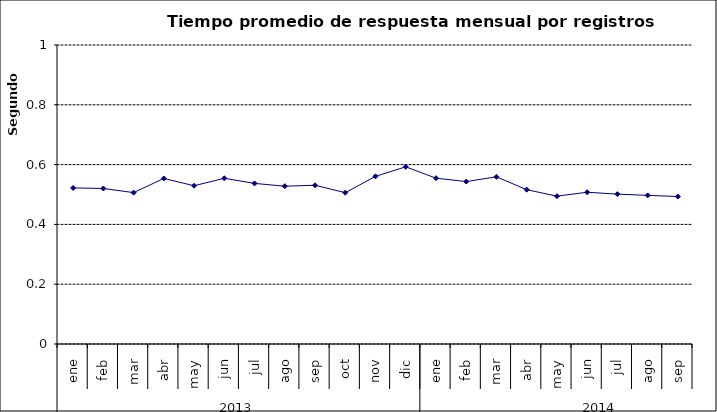
| Category | Tiempo promedio de respuesta por registros cámara PH ** |
|---|---|
| 0 | 0.522 |
| 1 | 0.52 |
| 2 | 0.506 |
| 3 | 0.554 |
| 4 | 0.529 |
| 5 | 0.554 |
| 6 | 0.537 |
| 7 | 0.528 |
| 8 | 0.531 |
| 9 | 0.506 |
| 10 | 0.561 |
| 11 | 0.593 |
| 12 | 0.555 |
| 13 | 0.543 |
| 14 | 0.559 |
| 15 | 0.516 |
| 16 | 0.494 |
| 17 | 0.508 |
| 18 | 0.501 |
| 19 | 0.497 |
| 20 | 0.493 |